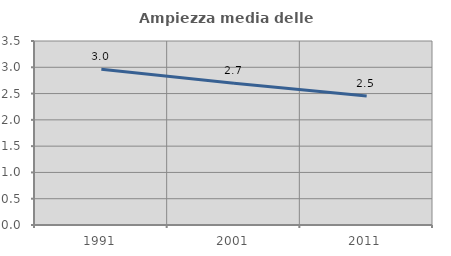
| Category | Ampiezza media delle famiglie |
|---|---|
| 1991.0 | 2.962 |
| 2001.0 | 2.697 |
| 2011.0 | 2.455 |